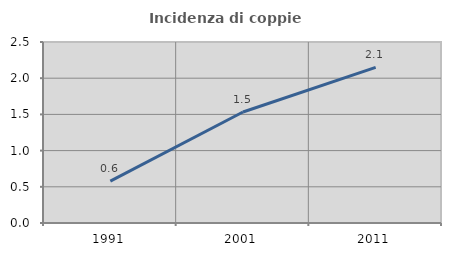
| Category | Incidenza di coppie miste |
|---|---|
| 1991.0 | 0.577 |
| 2001.0 | 1.533 |
| 2011.0 | 2.149 |